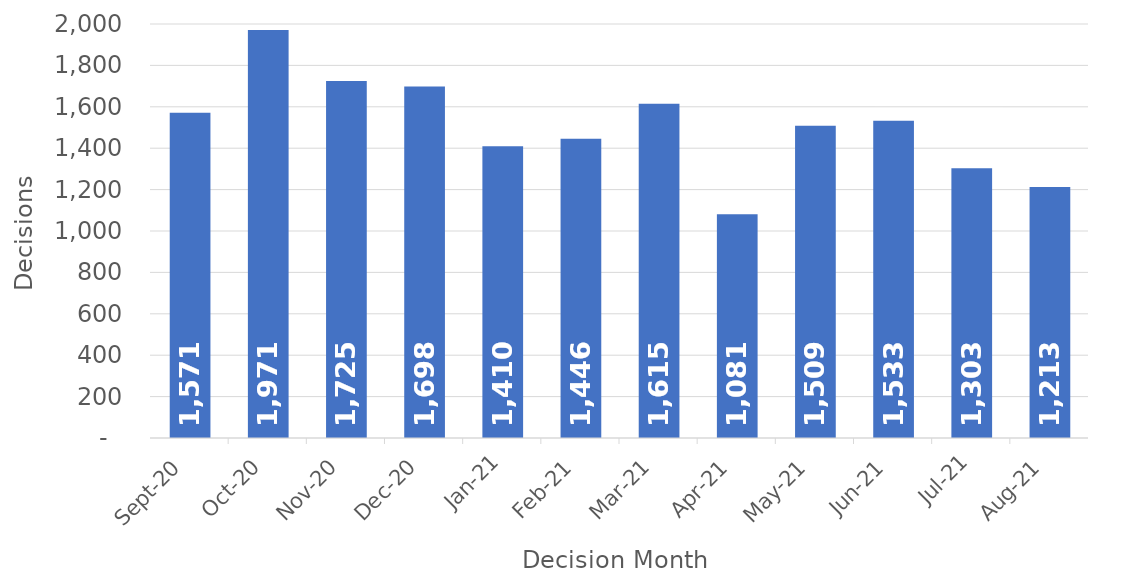
| Category | Decisions |
|---|---|
| 2020-09-01 | 1571 |
| 2020-10-01 | 1971 |
| 2020-11-01 | 1725 |
| 2020-12-01 | 1698 |
| 2021-01-01 | 1410 |
| 2021-02-01 | 1446 |
| 2021-03-01 | 1615 |
| 2021-04-01 | 1081 |
| 2021-05-01 | 1509 |
| 2021-06-01 | 1533 |
| 2021-07-01 | 1303 |
| 2021-08-01 | 1213 |